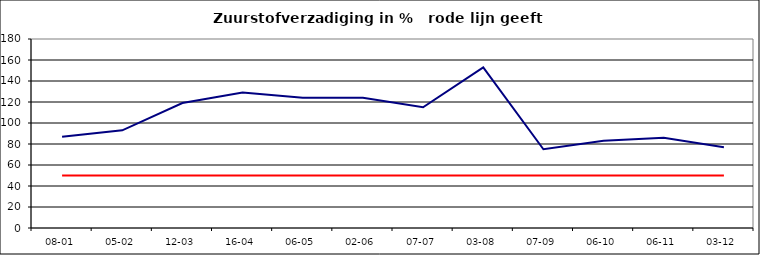
| Category | Series 0 | Series 1 |
|---|---|---|
| 08-01 | 87 | 50 |
| 05-02 | 93 | 50 |
| 12-03 | 119 | 50 |
| 16-04 | 129 | 50 |
| 06-05 | 124 | 50 |
| 02-06 | 124 | 50 |
| 07-07 | 115 | 50 |
| 03-08 | 153 | 50 |
| 07-09 | 75 | 50 |
| 06-10 | 83 | 50 |
| 06-11 | 86 | 50 |
| 03-12 | 77 | 50 |